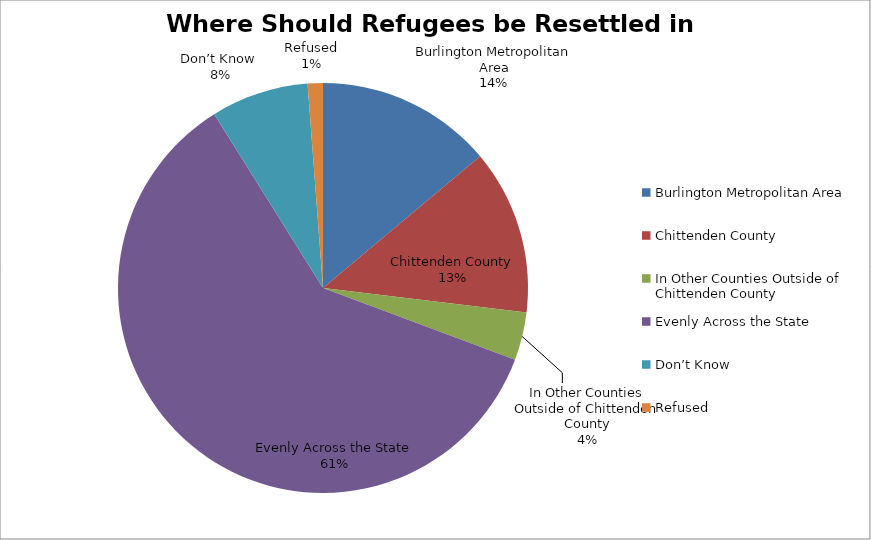
| Category | Valid Percent | Percent | Frequency |
|---|---|---|---|
| Burlington Metropolitan Area | 13.9 | 13.9 | 73 |
| Chittenden County | 13 | 13 | 68 |
| In Other Counties Outside of Chittenden County | 3.8 | 3.8 | 20 |
| Evenly Across the State | 60.4 | 60.5 | 316 |
| Don’t Know  | 7.7 | 7.7 | 40 |
| Refused | 1.2 | 1.2 | 6 |